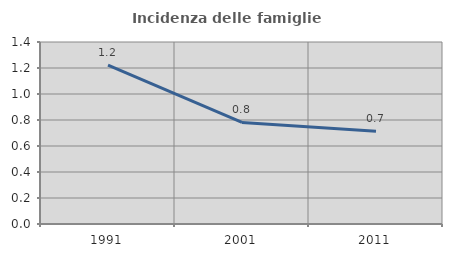
| Category | Incidenza delle famiglie numerose |
|---|---|
| 1991.0 | 1.222 |
| 2001.0 | 0.781 |
| 2011.0 | 0.714 |